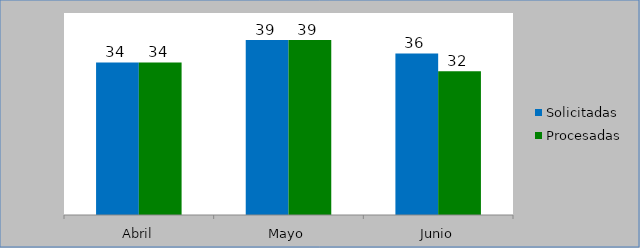
| Category | Solicitadas | Procesadas |
|---|---|---|
| Abril | 34 | 34 |
| Mayo | 39 | 39 |
| Junio | 36 | 32 |